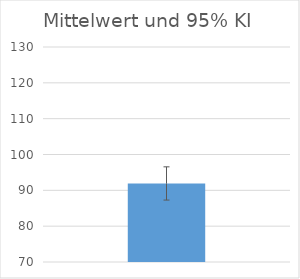
| Category | Mittelwert |
|---|---|
| 0 | 91.92 |